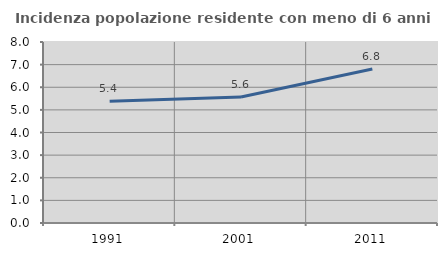
| Category | Incidenza popolazione residente con meno di 6 anni |
|---|---|
| 1991.0 | 5.378 |
| 2001.0 | 5.57 |
| 2011.0 | 6.807 |